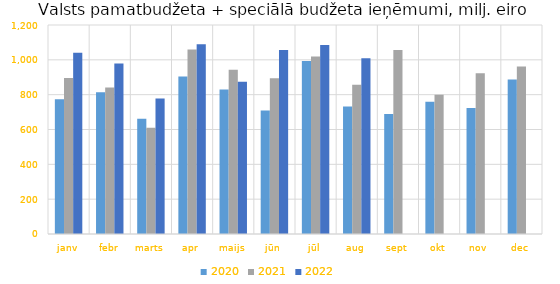
| Category | 2020 | 2021 | 2022 |
|---|---|---|---|
| janv | 773304.554 | 895228.16 | 1040582.151 |
| febr | 813349.653 | 841554.321 | 979083.527 |
| marts | 661290.08 | 610601.687 | 778451.361 |
| apr | 904088.68 | 1058636.045 | 1089522.586 |
| maijs | 829058.448 | 942788.526 | 873781.393 |
| jūn | 708595.585 | 894159.676 | 1056226.576 |
| jūl | 993444.303 | 1019598.16 | 1084656.571 |
| aug | 732304.111 | 856870.053 | 1009449.844 |
| sept | 689373.934 | 1056590.029 | 0 |
| okt | 759885.766 | 799251.823 | 0 |
| nov | 723122.398 | 922897.393 | 0 |
| dec | 887581.002 | 961417.995 | 0 |